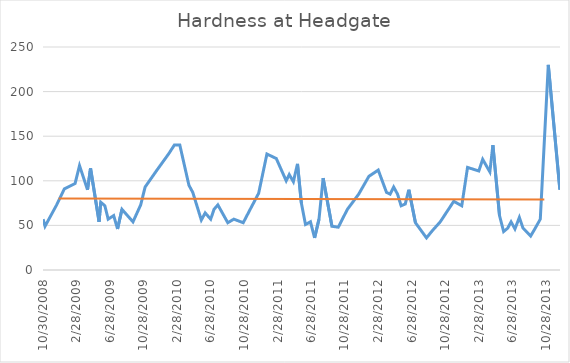
| Category | Hardness |
|---|---|
| 10/30/08 | 57 |
| 11/6/08 | 49 |
| 12/18/08 | 73 |
| 1/15/09 | 91 |
| 2/23/09 | 97 |
| 3/11/09 | 117 |
| 4/9/09 | 90 |
| 4/20/09 | 114 |
| 5/21/09 | 54 |
| 5/27/09 | 76 |
| 6/11/09 | 72 |
| 6/23/09 | 57 |
| 7/13/09 | 61 |
| 7/27/09 | 46 |
| 8/12/09 | 68 |
| 9/21/09 | 54 |
| 10/19/09 | 73 |
| 11/4/09 | 93 |
| 12/17/09 | 112 |
| 1/28/10 | 130 |
| 2/18/10 | 140 |
| 3/10/10 | 140 |
| 4/12/10 | 95 |
| 4/26/10 | 87 |
| 5/12/10 | 71 |
| 5/27/10 | 56 |
| 6/10/10 | 64 |
| 6/30/10 | 57 |
| 7/12/10 | 68 |
| 7/26/10 | 73 |
| 8/31/10 | 53 |
| 9/22/10 | 57 |
| 10/26/10 | 53 |
| 11/22/10 | 69 |
| 12/21/10 | 86 |
| 1/20/11 | 130 |
| 2/23/11 | 125 |
| 3/31/11 | 100 |
| 4/11/11 | 107 |
| 4/26/11 | 99 |
| 5/11/11 | 119 |
| 5/25/11 | 75 |
| 6/9/11 | 51 |
| 6/27/11 | 54 |
| 7/12/11 | 36 |
| 7/28/11 | 57 |
| 8/12/11 | 103 |
| 9/13/11 | 49 |
| 10/6/11 | 48 |
| 11/8/11 | 68 |
| 12/19/11 | 85 |
| 1/25/12 | 105 |
| 2/28/12 | 112 |
| 3/29/12 | 87 |
| 4/11/12 | 85 |
| 4/24/12 | 93 |
| 5/8/12 | 85 |
| 5/21/12 | 72 |
| 6/5/12 | 74 |
| 6/18/12 | 90 |
| 7/12/12 | 53 |
| 8/21/12 | 36 |
| 9/11/12 | 44 |
| 10/10/12 | 54 |
| 11/28/12 | 77 |
| 12/27/12 | 72 |
| 1/17/13 | 115 |
| 2/27/13 | 111 |
| 3/13/13 | 124 |
| 4/8/13 | 110 |
| 4/19/13 | 140 |
| 5/13/13 | 61 |
| 5/28/13 | 43 |
| 6/12/13 | 47 |
| 6/24/13 | 54 |
| 7/8/13 | 46 |
| 7/24/13 | 59 |
| 8/6/13 | 47 |
| 9/3/13 | 38 |
| 9/18/13 | 46 |
| 10/8/13 | 57 |
| 11/6/13 | 230 |
| 12/18/13 | 90 |